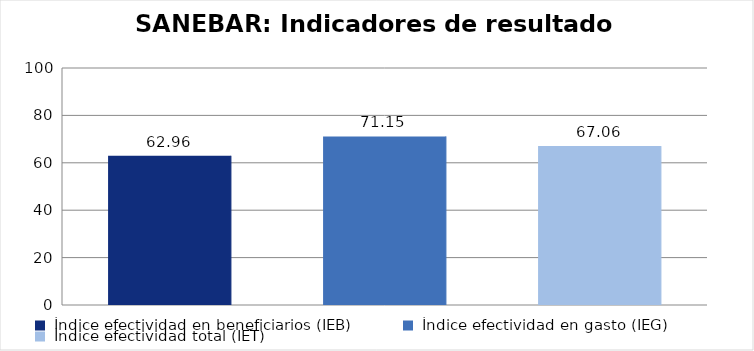
| Category | Total Programa |
|---|---|
| Índice efectividad en beneficiarios (IEB) | 62.963 |
| Índice efectividad en gasto (IEG)  | 71.148 |
| Índice efectividad total (IET) | 67.056 |